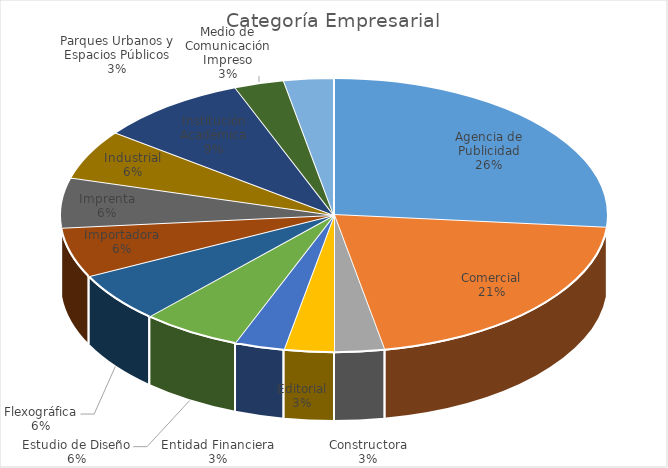
| Category | Total |
|---|---|
| Agencia de Publicidad | 9 |
| Comercial | 7 |
| Constructora | 1 |
| Editorial | 1 |
| Entidad Financiera | 1 |
| Estudio de Diseño | 2 |
| Flexográfica | 2 |
| Importadora | 2 |
| Imprenta | 2 |
| Industrial | 2 |
| Institución Académica | 3 |
| Medio de Comunicación Impreso | 1 |
| Parques Urbanos y Espacios Públicos | 1 |